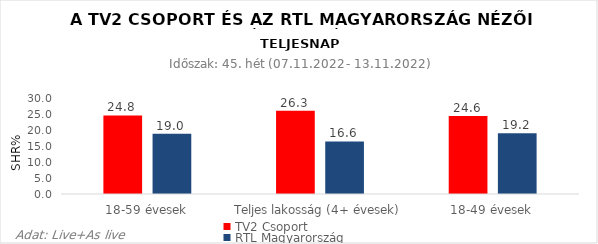
| Category | TV2 Csoport | RTL Magyarország |
|---|---|---|
| 18-59 évesek | 24.8 | 19 |
| Teljes lakosság (4+ évesek) | 26.3 | 16.6 |
| 18-49 évesek | 24.6 | 19.2 |